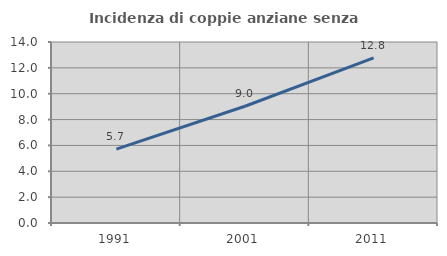
| Category | Incidenza di coppie anziane senza figli  |
|---|---|
| 1991.0 | 5.709 |
| 2001.0 | 9.032 |
| 2011.0 | 12.778 |